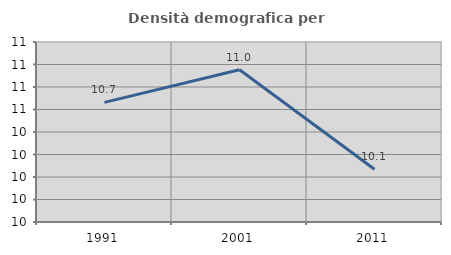
| Category | Densità demografica |
|---|---|
| 1991.0 | 10.663 |
| 2001.0 | 10.953 |
| 2011.0 | 10.068 |